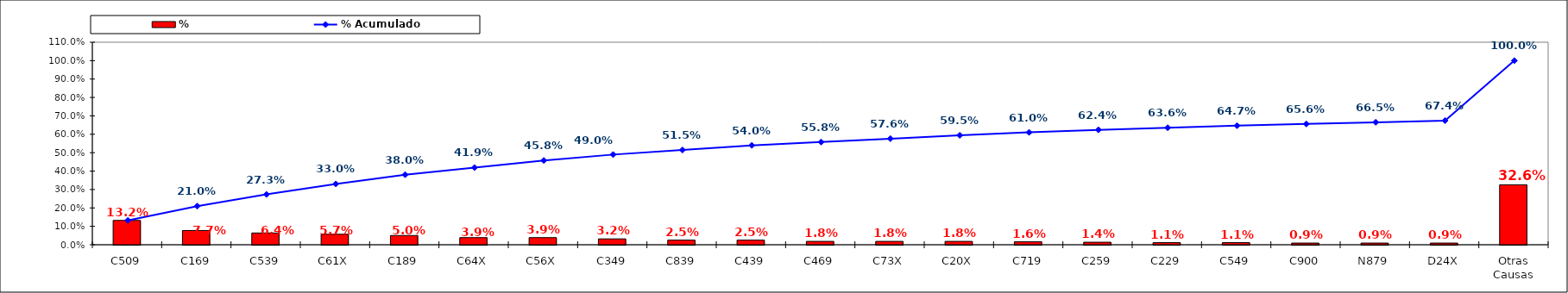
| Category | % |
|---|---|
| C509 | 0.132 |
| C169 | 0.077 |
| C539 | 0.064 |
| C61X | 0.057 |
| C189 | 0.05 |
| C64X | 0.039 |
| C56X | 0.039 |
| C349 | 0.032 |
| C839 | 0.025 |
| C439 | 0.025 |
| C469 | 0.018 |
| C73X | 0.018 |
| C20X | 0.018 |
| C719 | 0.016 |
| C259 | 0.014 |
| C229 | 0.011 |
| C549 | 0.011 |
| C900 | 0.009 |
| N879 | 0.009 |
| D24X | 0.009 |
| Otras Causas | 0.326 |